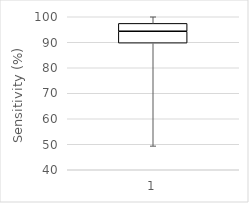
| Category | Series 0 | Series 1 | Series 2 | Series 3 | Series 4 |
|---|---|---|---|---|---|
| 0 | 48.7 | 40.95 | 4.665 | 3.085 | 2.6 |